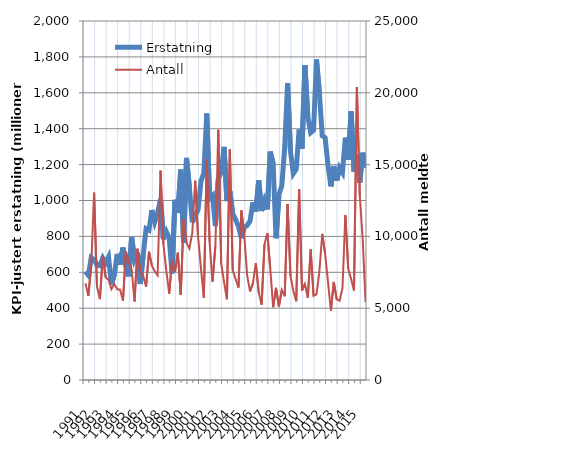
| Category | Erstatning |
|---|---|
| 1991.0 | 603.481 |
| nan | 583.801 |
| nan | 681.18 |
| nan | 669.603 |
| 1992.0 | 640.692 |
| nan | 636.6 |
| nan | 679.715 |
| nan | 652.46 |
| 1993.0 | 685.11 |
| nan | 532.071 |
| nan | 587.038 |
| nan | 702.553 |
| 1994.0 | 643.28 |
| nan | 737.946 |
| nan | 632.475 |
| nan | 577.464 |
| 1995.0 | 795.896 |
| nan | 672.716 |
| nan | 709.814 |
| nan | 535.299 |
| 1996.0 | 697.434 |
| nan | 842.561 |
| nan | 834.158 |
| nan | 946.501 |
| 1997.0 | 880.353 |
| nan | 930.976 |
| nan | 1009.305 |
| nan | 784.671 |
| 1998.0 | 826.639 |
| nan | 792.153 |
| nan | 593.691 |
| nan | 1004.115 |
| 1999.0 | 930.353 |
| nan | 1171.553 |
| nan | 763.248 |
| nan | 1237.391 |
| 2000.0 | 1073.081 |
| nan | 878.192 |
| nan | 918.127 |
| nan | 947.533 |
| 2001.0 | 1107.577 |
| nan | 1152.908 |
| nan | 1484.498 |
| nan | 1011.7 |
| 2002.0 | 1027.564 |
| nan | 857.616 |
| nan | 1119.058 |
| nan | 1157.483 |
| 2003.0 | 1298.758 |
| nan | 996.944 |
| nan | 1052.381 |
| nan | 926.811 |
| 2004.0 | 893.862 |
| nan | 855.082 |
| nan | 790.749 |
| nan | 851.902 |
| 2005.0 | 861.134 |
| nan | 885.928 |
| nan | 989.7 |
| nan | 939.181 |
| 2006.0 | 1112.107 |
| nan | 941.928 |
| nan | 998.915 |
| nan | 950.247 |
| 2007.0 | 1272.529 |
| nan | 1205.484 |
| nan | 789.79 |
| nan | 1033.21 |
| 2008.0 | 1082.173 |
| nan | 1294.715 |
| nan | 1653.143 |
| nan | 1273.488 |
| 2009.0 | 1149.85 |
| nan | 1173.942 |
| nan | 1395.31 |
| nan | 1289.196 |
| 2010.0 | 1753.533 |
| nan | 1467.453 |
| nan | 1377.784 |
| nan | 1391.074 |
| 2011.0 | 1786.114 |
| nan | 1602.462 |
| nan | 1359.902 |
| nan | 1349.973 |
| 2012.0 | 1195.733 |
| nan | 1078.773 |
| nan | 1192.147 |
| nan | 1110.769 |
| 2013.0 | 1181.853 |
| nan | 1155.655 |
| nan | 1350.015 |
| nan | 1227.003 |
| 2014.0 | 1496.943 |
| nan | 1160.463 |
| nan | 1258.954 |
| nan | 1098.824 |
| 2015.0 | 1265.965 |
| nan | 1183.401 |